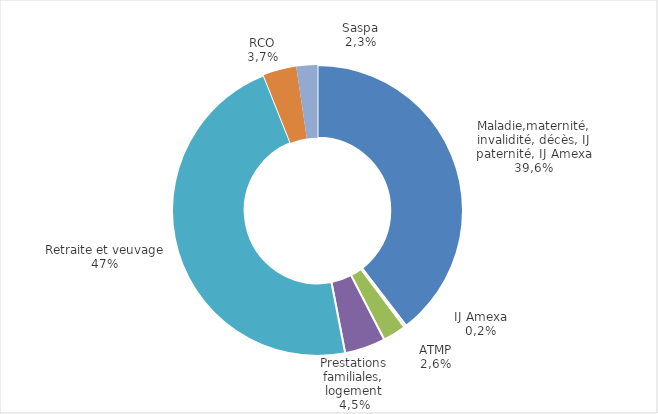
| Category | Series 0 |
|---|---|
| Maladie, maternité, invalidité, décès | 11111.759 |
| IJ Amexa | 69.9 |
| ATMP | 726.941 |
| Prestations familiales, Logement | 1274.841 |
| Retraite et veuvage | 13202.157 |
| Retraite complémentaire obligatoire (RCO) | 1038.67 |
| Minimum vieillesse (Saspa)** | 655.855 |